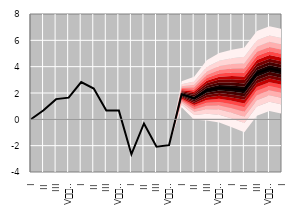
| Category | Series 0 |
|---|---|
| I | 0.006 |
| II | 0.687 |
| III | 1.534 |
| IV
2010. | 1.645 |
| I | 2.832 |
| II | 2.339 |
| III | 0.665 |
| IV
2011. | 0.675 |
| I | -2.657 |
| II | -0.315 |
| III | -2.076 |
| IV
2012. | -1.964 |
| I | 1.9 |
| II | 1.6 |
| III | 2.2 |
| IV
2013. | 2.4 |
| I | 2.347 |
| II | 2.234 |
| III | 3.487 |
| IV
2014. | 3.852 |
| I | 3.648 |